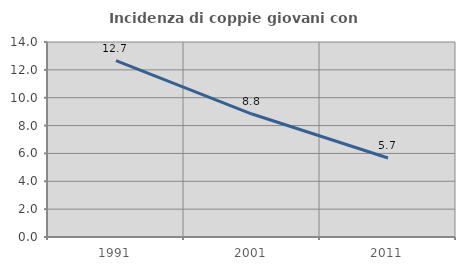
| Category | Incidenza di coppie giovani con figli |
|---|---|
| 1991.0 | 12.656 |
| 2001.0 | 8.828 |
| 2011.0 | 5.672 |